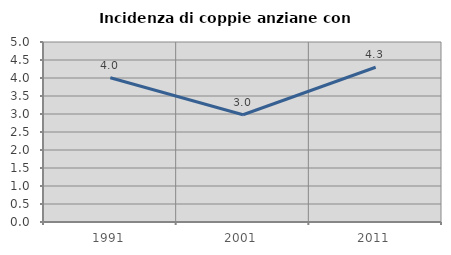
| Category | Incidenza di coppie anziane con figli |
|---|---|
| 1991.0 | 4.007 |
| 2001.0 | 2.98 |
| 2011.0 | 4.299 |